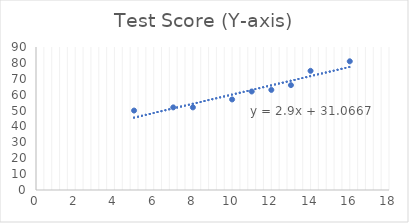
| Category | Test Score (Y-axis) |
|---|---|
| 14.0 | 75 |
| 7.0 | 52 |
| 13.0 | 66 |
| 11.0 | 62 |
| 8.0 | 52 |
| 10.0 | 57 |
| 5.0 | 50 |
| 16.0 | 81 |
| 12.0 | 63 |